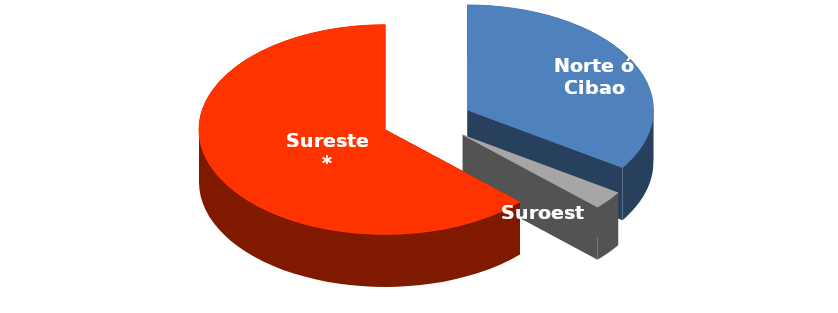
| Category | CANTIDAD |
|---|---|
| Norte ó Cibao | 109 |
| Suroeste | 9 |
| Sureste* | 200 |